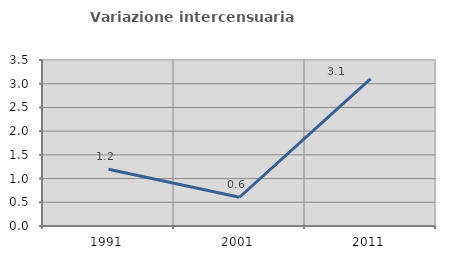
| Category | Variazione intercensuaria annua |
|---|---|
| 1991.0 | 1.197 |
| 2001.0 | 0.606 |
| 2011.0 | 3.102 |